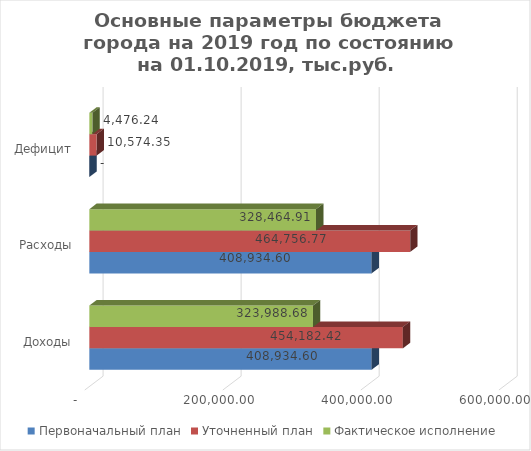
| Category | Первоначальный план | Уточненный план | Фактическое исполнение |
|---|---|---|---|
| Доходы | 408934.598 | 454182.423 | 323988.678 |
| Расходы | 408934.598 | 464756.771 | 328464.914 |
| Дефицит | 0 | 10574.348 | 4476.236 |